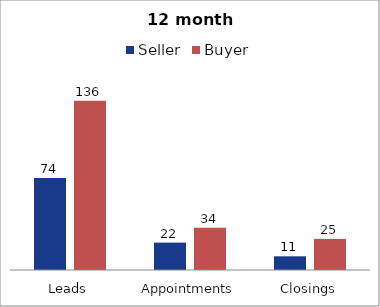
| Category | Seller | Buyer |
|---|---|---|
| Leads | 74 | 136 |
| Appointments | 22 | 34 |
| Closings | 11 | 25 |